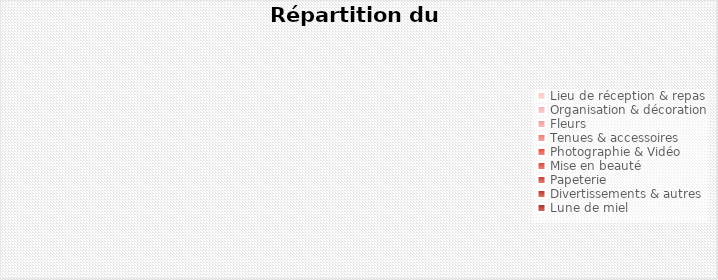
| Category | Series 0 |
|---|---|
| Lieu de réception & repas | 0 |
| Organisation & décoration | 0 |
| Fleurs | 0 |
| Tenues & accessoires | 0 |
| Photographie & Vidéo | 0 |
| Mise en beauté | 0 |
| Papeterie | 0 |
| Divertissements & autres | 0 |
| Lune de miel | 0 |